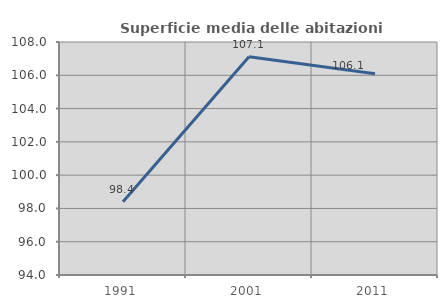
| Category | Superficie media delle abitazioni occupate |
|---|---|
| 1991.0 | 98.399 |
| 2001.0 | 107.108 |
| 2011.0 | 106.087 |